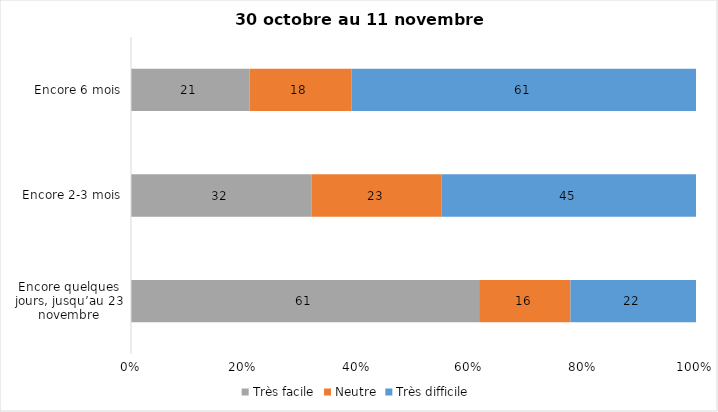
| Category | Très facile | Neutre | Très difficile |
|---|---|---|---|
| Encore quelques jours, jusqu’au 23 novembre | 61 | 16 | 22 |
| Encore 2-3 mois | 32 | 23 | 45 |
| Encore 6 mois | 21 | 18 | 61 |